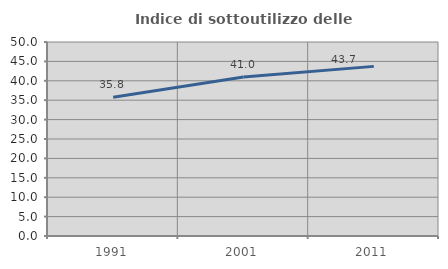
| Category | Indice di sottoutilizzo delle abitazioni  |
|---|---|
| 1991.0 | 35.785 |
| 2001.0 | 40.983 |
| 2011.0 | 43.719 |